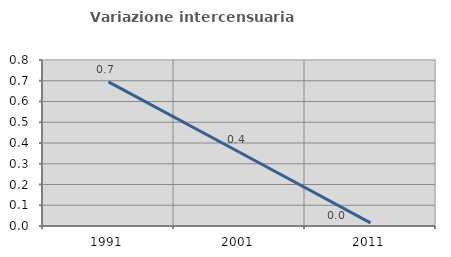
| Category | Variazione intercensuaria annua |
|---|---|
| 1991.0 | 0.695 |
| 2001.0 | 0.355 |
| 2011.0 | 0.015 |